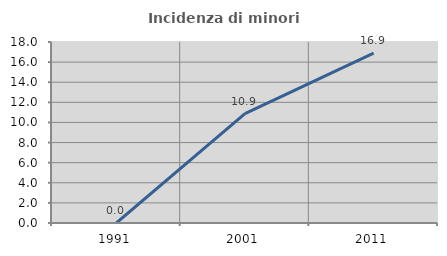
| Category | Incidenza di minori stranieri |
|---|---|
| 1991.0 | 0 |
| 2001.0 | 10.87 |
| 2011.0 | 16.901 |